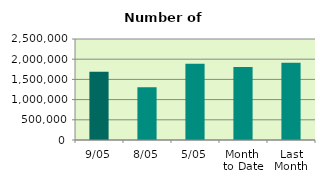
| Category | Series 0 |
|---|---|
| 9/05 | 1691236 |
| 8/05 | 1307834 |
| 5/05 | 1887118 |
| Month 
to Date | 1808549.667 |
| Last
Month | 1909115.889 |